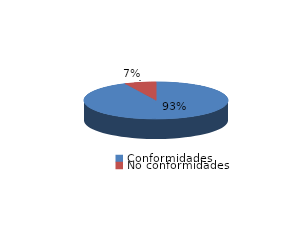
| Category | Series 0 |
|---|---|
| Conformidades | 315 |
| No conformidades | 24 |